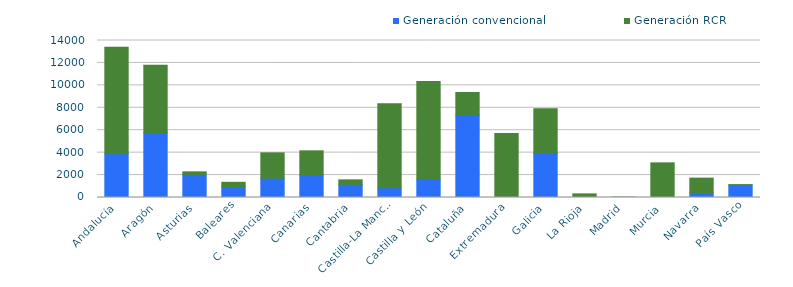
| Category | Generación convencional | Generación RCR |
|---|---|---|
| 0 | 3899.705 | 9488.96 |
| 1 | 5779.395 | 6015.92 |
| 2 | 2060.42 | 226.9 |
| 3 | 980.46 | 373.022 |
| 4 | 1717.3 | 2263.08 |
| 5 | 1992.32 | 2168.475 |
| 6 | 1169.42 | 403.7 |
| 7 | 865.7 | 7489.222 |
| 8 | 1597 | 8742.235 |
| 9 | 7335.29 | 2029.172 |
| 10 | 0 | 5713.54 |
| 11 | 3943.32 | 3961.29 |
| 12 | 0 | 322.35 |
| 13 | 0 | 38.47 |
| 14 | 0 | 3089.67 |
| 15 | 418.46 | 1309.65 |
| 16 | 1100 | 47 |